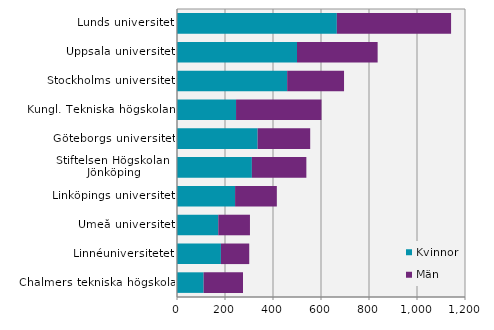
| Category | Kvinnor | Män |
|---|---|---|
| Lunds universitet | 666 | 476 |
| Uppsala universitet | 500 | 336 |
| Stockholms universitet | 459 | 237 |
| Kungl. Tekniska högskolan | 246 | 356 |
| Göteborgs universitet | 336 | 219 |
| Stiftelsen Högskolan i Jönköping | 312 | 227 |
| Linköpings universitet | 242 | 174 |
| Umeå universitet | 172 | 132 |
| Linnéuniversitetet | 183 | 118 |
| Chalmers tekniska högskola | 111 | 164 |